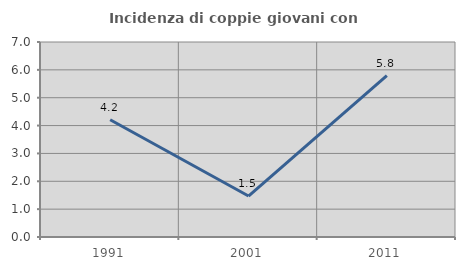
| Category | Incidenza di coppie giovani con figli |
|---|---|
| 1991.0 | 4.211 |
| 2001.0 | 1.471 |
| 2011.0 | 5.797 |